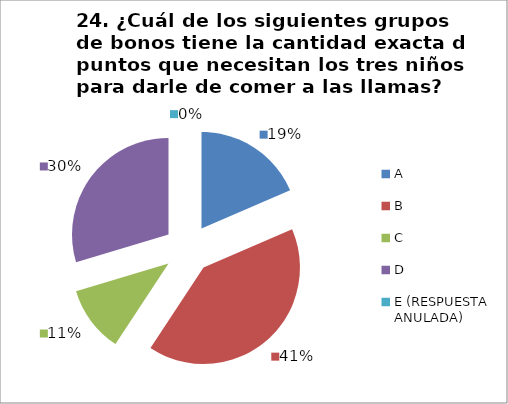
| Category | CANTIDAD DE RESPUESTAS PREGUNTA (24) | PORCENTAJE |
|---|---|---|
| A | 5 | 0.185 |
| B | 11 | 0.407 |
| C | 3 | 0.111 |
| D | 8 | 0.296 |
| E (RESPUESTA ANULADA) | 0 | 0 |